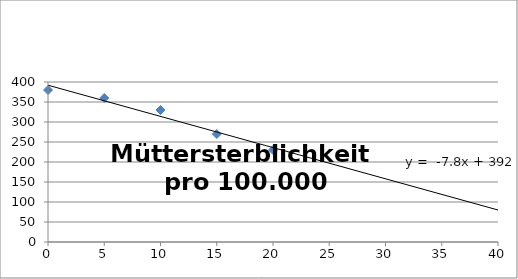
| Category | Series 0 |
|---|---|
| 0.0 | 380 |
| 5.0 | 360 |
| 10.0 | 330 |
| 15.0 | 270 |
| 20.0 | 230 |